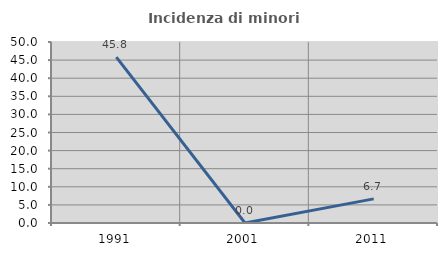
| Category | Incidenza di minori stranieri |
|---|---|
| 1991.0 | 45.833 |
| 2001.0 | 0 |
| 2011.0 | 6.667 |